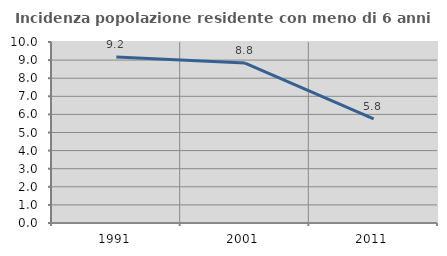
| Category | Incidenza popolazione residente con meno di 6 anni |
|---|---|
| 1991.0 | 9.174 |
| 2001.0 | 8.834 |
| 2011.0 | 5.753 |